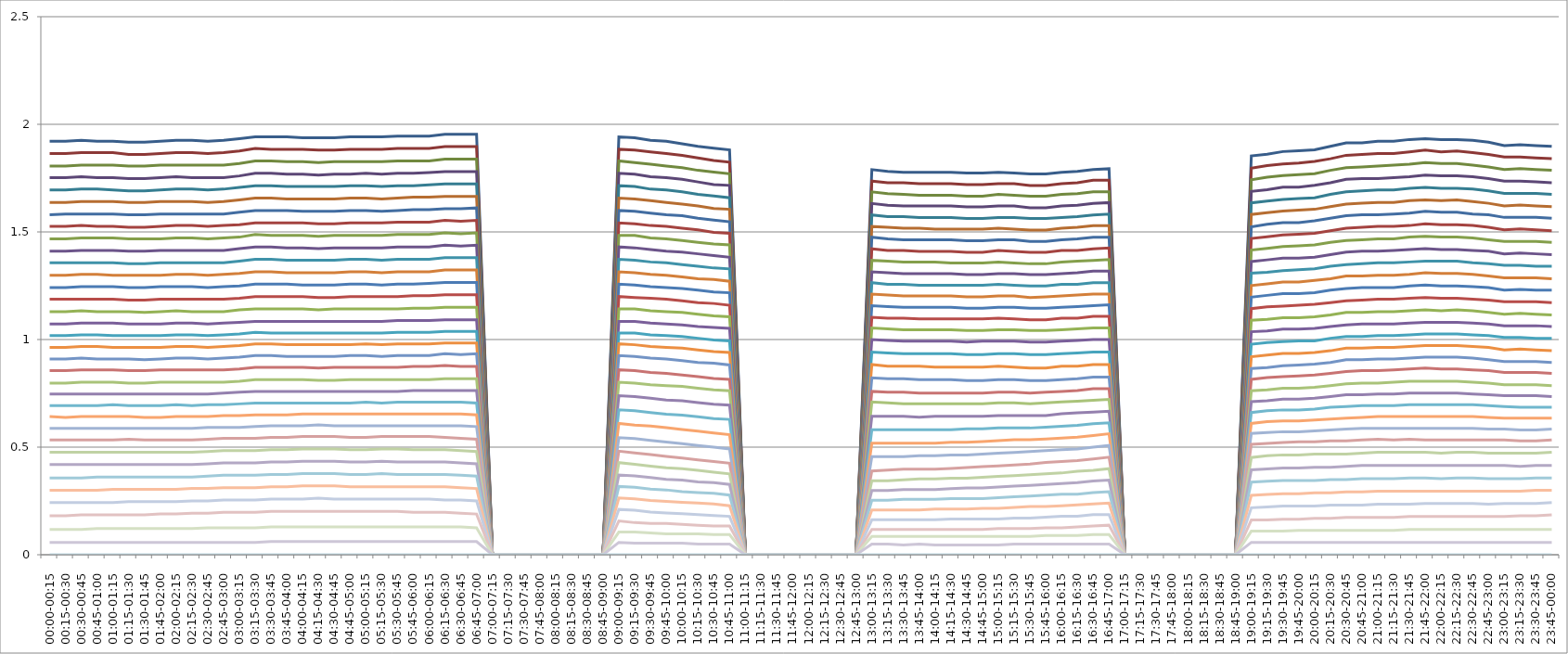
| Category | Series 0 | Series 1 | Series 2 | Series 3 | Series 4 | Series 5 | Series 6 | Series 7 | Series 8 | Series 9 | Series 10 | Series 11 | Series 12 | Series 13 | Series 14 | Series 15 | Series 16 | Series 17 | Series 18 | Series 19 | Series 20 | Series 21 | Series 22 | Series 23 | Series 24 | Series 25 | Series 26 | Series 27 | Series 28 | Series 29 | Series 30 | Series 31 | Series 32 | Series 33 | Series 34 |
|---|---|---|---|---|---|---|---|---|---|---|---|---|---|---|---|---|---|---|---|---|---|---|---|---|---|---|---|---|---|---|---|---|---|---|---|
| 00:00-00:15 | 1.921 | 1.864 | 1.806 | 1.752 | 1.695 | 1.637 | 1.579 | 1.526 | 1.468 | 1.41 | 1.356 | 1.299 | 1.241 | 1.188 | 1.13 | 1.072 | 1.018 | 0.964 | 0.91 | 0.855 | 0.798 | 0.747 | 0.693 | 0.642 | 0.588 | 0.533 | 0.476 | 0.419 | 0.357 | 0.3 | 0.242 | 0.181 | 0.118 | 0.057 | 0 |
| 00:15-00:30 | 1.921 | 1.864 | 1.806 | 1.752 | 1.695 | 1.637 | 1.583 | 1.526 | 1.468 | 1.41 | 1.356 | 1.299 | 1.241 | 1.188 | 1.13 | 1.072 | 1.018 | 0.964 | 0.91 | 0.855 | 0.798 | 0.747 | 0.693 | 0.638 | 0.588 | 0.533 | 0.476 | 0.419 | 0.357 | 0.3 | 0.242 | 0.181 | 0.118 | 0.057 | 0 |
| 00:30-00:45 | 1.925 | 1.868 | 1.81 | 1.756 | 1.699 | 1.641 | 1.583 | 1.53 | 1.472 | 1.414 | 1.356 | 1.303 | 1.245 | 1.188 | 1.134 | 1.076 | 1.022 | 0.968 | 0.914 | 0.859 | 0.802 | 0.747 | 0.693 | 0.642 | 0.588 | 0.533 | 0.476 | 0.419 | 0.357 | 0.3 | 0.242 | 0.185 | 0.118 | 0.057 | 0 |
| 00:45-01:00 | 1.921 | 1.868 | 1.81 | 1.752 | 1.699 | 1.641 | 1.583 | 1.526 | 1.472 | 1.414 | 1.356 | 1.303 | 1.245 | 1.188 | 1.13 | 1.076 | 1.022 | 0.968 | 0.91 | 0.859 | 0.802 | 0.747 | 0.693 | 0.642 | 0.588 | 0.533 | 0.476 | 0.419 | 0.361 | 0.3 | 0.242 | 0.185 | 0.121 | 0.057 | 0 |
| 01:00-01:15 | 1.921 | 1.868 | 1.81 | 1.752 | 1.695 | 1.641 | 1.583 | 1.526 | 1.472 | 1.414 | 1.356 | 1.299 | 1.245 | 1.188 | 1.13 | 1.076 | 1.018 | 0.964 | 0.91 | 0.859 | 0.802 | 0.747 | 0.697 | 0.642 | 0.588 | 0.533 | 0.476 | 0.419 | 0.361 | 0.304 | 0.242 | 0.185 | 0.121 | 0.057 | 0 |
| 01:15-01:30 | 1.917 | 1.86 | 1.806 | 1.748 | 1.691 | 1.637 | 1.579 | 1.522 | 1.468 | 1.41 | 1.352 | 1.299 | 1.241 | 1.184 | 1.13 | 1.072 | 1.018 | 0.964 | 0.91 | 0.855 | 0.798 | 0.747 | 0.693 | 0.642 | 0.588 | 0.537 | 0.476 | 0.419 | 0.361 | 0.304 | 0.246 | 0.185 | 0.121 | 0.057 | 0 |
| 01:30-01:45 | 1.917 | 1.86 | 1.806 | 1.748 | 1.691 | 1.637 | 1.579 | 1.522 | 1.468 | 1.41 | 1.352 | 1.299 | 1.241 | 1.184 | 1.126 | 1.072 | 1.018 | 0.964 | 0.906 | 0.855 | 0.798 | 0.747 | 0.693 | 0.638 | 0.588 | 0.533 | 0.476 | 0.419 | 0.361 | 0.304 | 0.246 | 0.185 | 0.121 | 0.057 | 0 |
| 01:45-02:00 | 1.921 | 1.864 | 1.81 | 1.752 | 1.695 | 1.641 | 1.583 | 1.526 | 1.468 | 1.414 | 1.356 | 1.299 | 1.245 | 1.188 | 1.13 | 1.072 | 1.018 | 0.964 | 0.91 | 0.859 | 0.802 | 0.747 | 0.693 | 0.638 | 0.588 | 0.533 | 0.476 | 0.419 | 0.361 | 0.304 | 0.246 | 0.189 | 0.121 | 0.057 | 0 |
| 02:00-02:15 | 1.925 | 1.868 | 1.81 | 1.756 | 1.699 | 1.641 | 1.583 | 1.53 | 1.472 | 1.414 | 1.356 | 1.303 | 1.245 | 1.188 | 1.134 | 1.076 | 1.022 | 0.968 | 0.914 | 0.859 | 0.802 | 0.747 | 0.697 | 0.642 | 0.588 | 0.533 | 0.476 | 0.419 | 0.361 | 0.304 | 0.246 | 0.189 | 0.121 | 0.057 | 0 |
| 02:15-02:30 | 1.925 | 1.868 | 1.81 | 1.752 | 1.699 | 1.641 | 1.583 | 1.53 | 1.472 | 1.414 | 1.356 | 1.303 | 1.245 | 1.188 | 1.13 | 1.076 | 1.022 | 0.968 | 0.914 | 0.859 | 0.802 | 0.747 | 0.693 | 0.642 | 0.588 | 0.533 | 0.476 | 0.419 | 0.361 | 0.308 | 0.25 | 0.193 | 0.121 | 0.057 | 0 |
| 02:30-02:45 | 1.921 | 1.864 | 1.81 | 1.752 | 1.695 | 1.637 | 1.583 | 1.526 | 1.468 | 1.414 | 1.356 | 1.299 | 1.241 | 1.188 | 1.13 | 1.072 | 1.018 | 0.964 | 0.91 | 0.859 | 0.802 | 0.747 | 0.697 | 0.642 | 0.592 | 0.537 | 0.48 | 0.423 | 0.365 | 0.308 | 0.25 | 0.193 | 0.125 | 0.057 | 0 |
| 02:45-03:00 | 1.925 | 1.868 | 1.81 | 1.752 | 1.699 | 1.641 | 1.583 | 1.53 | 1.472 | 1.414 | 1.356 | 1.303 | 1.245 | 1.188 | 1.13 | 1.076 | 1.022 | 0.968 | 0.914 | 0.859 | 0.802 | 0.751 | 0.697 | 0.646 | 0.592 | 0.541 | 0.484 | 0.427 | 0.369 | 0.312 | 0.254 | 0.197 | 0.125 | 0.057 | 0 |
| 03:00-03:15 | 1.933 | 1.876 | 1.818 | 1.76 | 1.707 | 1.649 | 1.591 | 1.534 | 1.476 | 1.422 | 1.364 | 1.307 | 1.249 | 1.192 | 1.138 | 1.08 | 1.026 | 0.972 | 0.918 | 0.863 | 0.806 | 0.755 | 0.701 | 0.646 | 0.592 | 0.541 | 0.484 | 0.427 | 0.369 | 0.312 | 0.254 | 0.197 | 0.125 | 0.057 | 0 |
| 03:15-03:30 | 1.941 | 1.888 | 1.83 | 1.772 | 1.715 | 1.657 | 1.599 | 1.542 | 1.488 | 1.43 | 1.372 | 1.315 | 1.257 | 1.2 | 1.142 | 1.084 | 1.034 | 0.98 | 0.926 | 0.871 | 0.814 | 0.759 | 0.705 | 0.65 | 0.596 | 0.541 | 0.484 | 0.427 | 0.369 | 0.312 | 0.254 | 0.197 | 0.125 | 0.057 | 0 |
| 03:30-03:45 | 1.941 | 1.884 | 1.83 | 1.772 | 1.715 | 1.657 | 1.599 | 1.542 | 1.484 | 1.43 | 1.372 | 1.315 | 1.257 | 1.2 | 1.142 | 1.084 | 1.03 | 0.98 | 0.926 | 0.871 | 0.814 | 0.759 | 0.705 | 0.65 | 0.6 | 0.545 | 0.488 | 0.431 | 0.373 | 0.316 | 0.258 | 0.201 | 0.129 | 0.061 | 0 |
| 03:45-04:00 | 1.941 | 1.884 | 1.826 | 1.768 | 1.711 | 1.653 | 1.599 | 1.542 | 1.484 | 1.426 | 1.368 | 1.311 | 1.257 | 1.2 | 1.142 | 1.084 | 1.03 | 0.976 | 0.922 | 0.871 | 0.814 | 0.759 | 0.705 | 0.65 | 0.6 | 0.545 | 0.488 | 0.431 | 0.373 | 0.316 | 0.258 | 0.201 | 0.129 | 0.061 | 0 |
| 04:00-04:15 | 1.937 | 1.884 | 1.826 | 1.768 | 1.711 | 1.653 | 1.595 | 1.542 | 1.484 | 1.426 | 1.368 | 1.311 | 1.253 | 1.2 | 1.142 | 1.084 | 1.03 | 0.976 | 0.922 | 0.871 | 0.814 | 0.759 | 0.705 | 0.654 | 0.6 | 0.549 | 0.492 | 0.435 | 0.377 | 0.32 | 0.258 | 0.201 | 0.129 | 0.061 | 0 |
| 04:15-04:30 | 1.937 | 1.88 | 1.822 | 1.764 | 1.711 | 1.653 | 1.595 | 1.538 | 1.48 | 1.422 | 1.368 | 1.311 | 1.253 | 1.196 | 1.138 | 1.084 | 1.03 | 0.976 | 0.922 | 0.867 | 0.81 | 0.759 | 0.705 | 0.654 | 0.604 | 0.549 | 0.492 | 0.435 | 0.377 | 0.32 | 0.262 | 0.201 | 0.129 | 0.061 | 0 |
| 04:30-04:45 | 1.937 | 1.88 | 1.826 | 1.768 | 1.711 | 1.653 | 1.595 | 1.538 | 1.484 | 1.426 | 1.368 | 1.311 | 1.253 | 1.196 | 1.142 | 1.084 | 1.03 | 0.976 | 0.922 | 0.871 | 0.81 | 0.759 | 0.705 | 0.654 | 0.6 | 0.549 | 0.492 | 0.435 | 0.377 | 0.32 | 0.258 | 0.201 | 0.129 | 0.061 | 0 |
| 04:45-05:00 | 1.941 | 1.884 | 1.826 | 1.768 | 1.715 | 1.657 | 1.599 | 1.542 | 1.484 | 1.426 | 1.372 | 1.315 | 1.257 | 1.2 | 1.142 | 1.084 | 1.03 | 0.976 | 0.926 | 0.871 | 0.814 | 0.759 | 0.705 | 0.654 | 0.6 | 0.545 | 0.488 | 0.431 | 0.373 | 0.316 | 0.258 | 0.201 | 0.129 | 0.061 | 0 |
| 05:00-05:15 | 1.941 | 1.884 | 1.826 | 1.772 | 1.715 | 1.657 | 1.599 | 1.542 | 1.484 | 1.426 | 1.372 | 1.315 | 1.257 | 1.2 | 1.142 | 1.084 | 1.03 | 0.98 | 0.926 | 0.871 | 0.814 | 0.759 | 0.709 | 0.654 | 0.6 | 0.545 | 0.488 | 0.431 | 0.373 | 0.316 | 0.258 | 0.201 | 0.129 | 0.061 | 0 |
| 05:15-05:30 | 1.941 | 1.884 | 1.826 | 1.768 | 1.711 | 1.653 | 1.595 | 1.542 | 1.484 | 1.426 | 1.368 | 1.311 | 1.253 | 1.2 | 1.142 | 1.084 | 1.03 | 0.976 | 0.922 | 0.871 | 0.814 | 0.759 | 0.705 | 0.654 | 0.6 | 0.549 | 0.492 | 0.435 | 0.377 | 0.316 | 0.258 | 0.201 | 0.129 | 0.061 | 0 |
| 05:30-05:45 | 1.945 | 1.888 | 1.83 | 1.772 | 1.715 | 1.657 | 1.599 | 1.546 | 1.488 | 1.43 | 1.372 | 1.315 | 1.257 | 1.2 | 1.142 | 1.088 | 1.034 | 0.98 | 0.926 | 0.871 | 0.814 | 0.759 | 0.709 | 0.654 | 0.6 | 0.549 | 0.492 | 0.431 | 0.373 | 0.316 | 0.258 | 0.201 | 0.129 | 0.061 | 0 |
| 05:45-06:00 | 1.945 | 1.888 | 1.83 | 1.772 | 1.715 | 1.661 | 1.603 | 1.546 | 1.488 | 1.43 | 1.372 | 1.315 | 1.257 | 1.204 | 1.146 | 1.088 | 1.034 | 0.98 | 0.926 | 0.875 | 0.814 | 0.763 | 0.709 | 0.654 | 0.6 | 0.549 | 0.488 | 0.431 | 0.373 | 0.316 | 0.258 | 0.197 | 0.129 | 0.061 | 0 |
| 06:00-06:15 | 1.945 | 1.888 | 1.83 | 1.776 | 1.719 | 1.661 | 1.603 | 1.546 | 1.488 | 1.43 | 1.372 | 1.315 | 1.261 | 1.204 | 1.146 | 1.088 | 1.034 | 0.98 | 0.926 | 0.875 | 0.814 | 0.763 | 0.709 | 0.654 | 0.6 | 0.549 | 0.488 | 0.431 | 0.373 | 0.316 | 0.258 | 0.197 | 0.129 | 0.061 | 0 |
| 06:15-06:30 | 1.953 | 1.896 | 1.838 | 1.78 | 1.723 | 1.665 | 1.607 | 1.554 | 1.496 | 1.438 | 1.38 | 1.323 | 1.265 | 1.208 | 1.15 | 1.092 | 1.038 | 0.984 | 0.934 | 0.879 | 0.818 | 0.763 | 0.709 | 0.654 | 0.6 | 0.545 | 0.488 | 0.431 | 0.373 | 0.316 | 0.254 | 0.197 | 0.129 | 0.061 | 0 |
| 06:30-06:45 | 1.953 | 1.896 | 1.838 | 1.78 | 1.723 | 1.665 | 1.607 | 1.55 | 1.492 | 1.434 | 1.38 | 1.323 | 1.265 | 1.208 | 1.15 | 1.092 | 1.038 | 0.984 | 0.93 | 0.875 | 0.818 | 0.763 | 0.709 | 0.654 | 0.6 | 0.541 | 0.484 | 0.427 | 0.369 | 0.312 | 0.254 | 0.193 | 0.129 | 0.061 | 0 |
| 06:45-07:00 | 1.953 | 1.896 | 1.838 | 1.78 | 1.723 | 1.665 | 1.611 | 1.554 | 1.496 | 1.438 | 1.38 | 1.323 | 1.265 | 1.208 | 1.15 | 1.092 | 1.038 | 0.984 | 0.934 | 0.875 | 0.818 | 0.763 | 0.705 | 0.65 | 0.596 | 0.537 | 0.48 | 0.423 | 0.365 | 0.308 | 0.25 | 0.189 | 0.125 | 0.061 | 0 |
| 07:00-07:15 | 0 | 0 | 0 | 0 | 0 | 0 | 0 | 0 | 0 | 0 | 0 | 0 | 0 | 0 | 0 | 0 | 0 | 0 | 0 | 0 | 0 | 0 | 0 | 0 | 0 | 0 | 0 | 0 | 0 | 0 | 0 | 0 | 0 | 0 | 0 |
| 07:15-07:30 | 0 | 0 | 0 | 0 | 0 | 0 | 0 | 0 | 0 | 0 | 0 | 0 | 0 | 0 | 0 | 0 | 0 | 0 | 0 | 0 | 0 | 0 | 0 | 0 | 0 | 0 | 0 | 0 | 0 | 0 | 0 | 0 | 0 | 0 | 0 |
| 07:30-07:45 | 0 | 0 | 0 | 0 | 0 | 0 | 0 | 0 | 0 | 0 | 0 | 0 | 0 | 0 | 0 | 0 | 0 | 0 | 0 | 0 | 0 | 0 | 0 | 0 | 0 | 0 | 0 | 0 | 0 | 0 | 0 | 0 | 0 | 0 | 0 |
| 07:45-08:00 | 0 | 0 | 0 | 0 | 0 | 0 | 0 | 0 | 0 | 0 | 0 | 0 | 0 | 0 | 0 | 0 | 0 | 0 | 0 | 0 | 0 | 0 | 0 | 0 | 0 | 0 | 0 | 0 | 0 | 0 | 0 | 0 | 0 | 0 | 0 |
| 08:00-08:15 | 0 | 0 | 0 | 0 | 0 | 0 | 0 | 0 | 0 | 0 | 0 | 0 | 0 | 0 | 0 | 0 | 0 | 0 | 0 | 0 | 0 | 0 | 0 | 0 | 0 | 0 | 0 | 0 | 0 | 0 | 0 | 0 | 0 | 0 | 0 |
| 08:15-08:30 | 0 | 0 | 0 | 0 | 0 | 0 | 0 | 0 | 0 | 0 | 0 | 0 | 0 | 0 | 0 | 0 | 0 | 0 | 0 | 0 | 0 | 0 | 0 | 0 | 0 | 0 | 0 | 0 | 0 | 0 | 0 | 0 | 0 | 0 | 0 |
| 08:30-08:45 | 0 | 0 | 0 | 0 | 0 | 0 | 0 | 0 | 0 | 0 | 0 | 0 | 0 | 0 | 0 | 0 | 0 | 0 | 0 | 0 | 0 | 0 | 0 | 0 | 0 | 0 | 0 | 0 | 0 | 0 | 0 | 0 | 0 | 0 | 0 |
| 08:45-09:00 | 0 | 0 | 0 | 0 | 0 | 0 | 0 | 0 | 0 | 0 | 0 | 0 | 0 | 0 | 0 | 0 | 0 | 0 | 0 | 0 | 0 | 0 | 0 | 0 | 0 | 0 | 0 | 0 | 0 | 0 | 0 | 0 | 0 | 0 | 0 |
| 09:00-09:15 | 1.941 | 1.884 | 1.83 | 1.772 | 1.715 | 1.657 | 1.599 | 1.542 | 1.484 | 1.43 | 1.372 | 1.315 | 1.257 | 1.2 | 1.142 | 1.084 | 1.03 | 0.98 | 0.926 | 0.859 | 0.802 | 0.739 | 0.673 | 0.61 | 0.544 | 0.481 | 0.428 | 0.371 | 0.317 | 0.264 | 0.21 | 0.157 | 0.106 | 0.057 | 0 |
| 09:15-09:30 | 1.937 | 1.88 | 1.822 | 1.768 | 1.711 | 1.653 | 1.595 | 1.538 | 1.484 | 1.426 | 1.368 | 1.311 | 1.253 | 1.196 | 1.142 | 1.084 | 1.03 | 0.976 | 0.922 | 0.855 | 0.798 | 0.735 | 0.669 | 0.602 | 0.54 | 0.473 | 0.42 | 0.367 | 0.313 | 0.26 | 0.206 | 0.149 | 0.106 | 0.053 | 0 |
| 09:30-09:45 | 1.925 | 1.872 | 1.814 | 1.756 | 1.699 | 1.645 | 1.587 | 1.53 | 1.472 | 1.418 | 1.36 | 1.303 | 1.245 | 1.192 | 1.134 | 1.076 | 1.022 | 0.968 | 0.914 | 0.847 | 0.79 | 0.727 | 0.661 | 0.598 | 0.532 | 0.465 | 0.412 | 0.359 | 0.305 | 0.252 | 0.198 | 0.145 | 0.102 | 0.053 | 0 |
| 09:45-10:00 | 1.921 | 1.864 | 1.806 | 1.752 | 1.695 | 1.637 | 1.579 | 1.526 | 1.468 | 1.41 | 1.356 | 1.299 | 1.241 | 1.188 | 1.13 | 1.072 | 1.018 | 0.964 | 0.91 | 0.843 | 0.786 | 0.719 | 0.653 | 0.59 | 0.524 | 0.457 | 0.404 | 0.351 | 0.301 | 0.248 | 0.194 | 0.145 | 0.098 | 0.053 | 0 |
| 10:00-10:15 | 1.909 | 1.856 | 1.798 | 1.744 | 1.687 | 1.629 | 1.575 | 1.518 | 1.46 | 1.406 | 1.348 | 1.291 | 1.237 | 1.18 | 1.126 | 1.068 | 1.014 | 0.96 | 0.902 | 0.835 | 0.782 | 0.715 | 0.649 | 0.582 | 0.516 | 0.449 | 0.4 | 0.347 | 0.293 | 0.244 | 0.19 | 0.141 | 0.098 | 0.053 | 0 |
| 10:15-10:30 | 1.897 | 1.844 | 1.786 | 1.732 | 1.675 | 1.621 | 1.563 | 1.51 | 1.452 | 1.398 | 1.34 | 1.283 | 1.229 | 1.172 | 1.118 | 1.06 | 1.006 | 0.952 | 0.894 | 0.827 | 0.774 | 0.707 | 0.641 | 0.574 | 0.508 | 0.441 | 0.392 | 0.339 | 0.289 | 0.24 | 0.186 | 0.137 | 0.098 | 0.049 | 0 |
| 10:30-10:45 | 1.889 | 1.832 | 1.778 | 1.72 | 1.667 | 1.609 | 1.555 | 1.498 | 1.444 | 1.39 | 1.332 | 1.279 | 1.221 | 1.168 | 1.11 | 1.056 | 0.998 | 0.944 | 0.89 | 0.819 | 0.766 | 0.699 | 0.633 | 0.566 | 0.5 | 0.433 | 0.384 | 0.335 | 0.285 | 0.236 | 0.182 | 0.133 | 0.094 | 0.049 | 0 |
| 10:45-11:00 | 1.881 | 1.824 | 1.77 | 1.716 | 1.659 | 1.605 | 1.547 | 1.494 | 1.44 | 1.382 | 1.328 | 1.271 | 1.217 | 1.16 | 1.106 | 1.052 | 0.994 | 0.94 | 0.882 | 0.815 | 0.762 | 0.695 | 0.629 | 0.558 | 0.492 | 0.425 | 0.376 | 0.327 | 0.277 | 0.228 | 0.178 | 0.133 | 0.094 | 0.049 | 0 |
| 11:00-11:15 | 0 | 0 | 0 | 0 | 0 | 0 | 0 | 0 | 0 | 0 | 0 | 0 | 0 | 0 | 0 | 0 | 0 | 0 | 0 | 0 | 0 | 0 | 0 | 0 | 0 | 0 | 0 | 0 | 0 | 0 | 0 | 0 | 0 | 0 | 0 |
| 11:15-11:30 | 0 | 0 | 0 | 0 | 0 | 0 | 0 | 0 | 0 | 0 | 0 | 0 | 0 | 0 | 0 | 0 | 0 | 0 | 0 | 0 | 0 | 0 | 0 | 0 | 0 | 0 | 0 | 0 | 0 | 0 | 0 | 0 | 0 | 0 | 0 |
| 11:30-11:45 | 0 | 0 | 0 | 0 | 0 | 0 | 0 | 0 | 0 | 0 | 0 | 0 | 0 | 0 | 0 | 0 | 0 | 0 | 0 | 0 | 0 | 0 | 0 | 0 | 0 | 0 | 0 | 0 | 0 | 0 | 0 | 0 | 0 | 0 | 0 |
| 11:45-12:00 | 0 | 0 | 0 | 0 | 0 | 0 | 0 | 0 | 0 | 0 | 0 | 0 | 0 | 0 | 0 | 0 | 0 | 0 | 0 | 0 | 0 | 0 | 0 | 0 | 0 | 0 | 0 | 0 | 0 | 0 | 0 | 0 | 0 | 0 | 0 |
| 12:00-12:15 | 0 | 0 | 0 | 0 | 0 | 0 | 0 | 0 | 0 | 0 | 0 | 0 | 0 | 0 | 0 | 0 | 0 | 0 | 0 | 0 | 0 | 0 | 0 | 0 | 0 | 0 | 0 | 0 | 0 | 0 | 0 | 0 | 0 | 0 | 0 |
| 12:15-12:30 | 0 | 0 | 0 | 0 | 0 | 0 | 0 | 0 | 0 | 0 | 0 | 0 | 0 | 0 | 0 | 0 | 0 | 0 | 0 | 0 | 0 | 0 | 0 | 0 | 0 | 0 | 0 | 0 | 0 | 0 | 0 | 0 | 0 | 0 | 0 |
| 12:30-12:45 | 0 | 0 | 0 | 0 | 0 | 0 | 0 | 0 | 0 | 0 | 0 | 0 | 0 | 0 | 0 | 0 | 0 | 0 | 0 | 0 | 0 | 0 | 0 | 0 | 0 | 0 | 0 | 0 | 0 | 0 | 0 | 0 | 0 | 0 | 0 |
| 12:45-13:00 | 0 | 0 | 0 | 0 | 0 | 0 | 0 | 0 | 0 | 0 | 0 | 0 | 0 | 0 | 0 | 0 | 0 | 0 | 0 | 0 | 0 | 0 | 0 | 0 | 0 | 0 | 0 | 0 | 0 | 0 | 0 | 0 | 0 | 0 | 0 |
| 13:00-13:15 | 1.789 | 1.736 | 1.686 | 1.632 | 1.579 | 1.525 | 1.475 | 1.422 | 1.368 | 1.314 | 1.264 | 1.211 | 1.157 | 1.104 | 1.054 | 1 | 0.942 | 0.884 | 0.822 | 0.759 | 0.71 | 0.643 | 0.581 | 0.518 | 0.456 | 0.389 | 0.344 | 0.299 | 0.253 | 0.208 | 0.162 | 0.117 | 0.086 | 0.049 | 0 |
| 13:15-13:30 | 1.781 | 1.728 | 1.678 | 1.624 | 1.571 | 1.521 | 1.467 | 1.414 | 1.364 | 1.31 | 1.256 | 1.207 | 1.153 | 1.1 | 1.05 | 0.996 | 0.938 | 0.876 | 0.818 | 0.755 | 0.706 | 0.643 | 0.581 | 0.518 | 0.456 | 0.393 | 0.344 | 0.299 | 0.253 | 0.208 | 0.162 | 0.117 | 0.086 | 0.049 | 0 |
| 13:30-13:45 | 1.777 | 1.728 | 1.674 | 1.62 | 1.571 | 1.517 | 1.463 | 1.414 | 1.36 | 1.306 | 1.256 | 1.203 | 1.149 | 1.1 | 1.046 | 0.992 | 0.934 | 0.876 | 0.818 | 0.755 | 0.702 | 0.643 | 0.581 | 0.518 | 0.456 | 0.397 | 0.348 | 0.303 | 0.257 | 0.208 | 0.162 | 0.117 | 0.086 | 0.045 | 0 |
| 13:45-14:00 | 1.777 | 1.724 | 1.67 | 1.62 | 1.567 | 1.517 | 1.463 | 1.41 | 1.36 | 1.306 | 1.252 | 1.203 | 1.149 | 1.096 | 1.046 | 0.992 | 0.934 | 0.876 | 0.814 | 0.751 | 0.702 | 0.639 | 0.581 | 0.518 | 0.46 | 0.397 | 0.352 | 0.303 | 0.257 | 0.208 | 0.162 | 0.117 | 0.086 | 0.049 | 0 |
| 14:00-14:15 | 1.777 | 1.724 | 1.67 | 1.62 | 1.567 | 1.513 | 1.463 | 1.41 | 1.36 | 1.306 | 1.252 | 1.203 | 1.149 | 1.096 | 1.046 | 0.992 | 0.934 | 0.872 | 0.814 | 0.751 | 0.702 | 0.643 | 0.581 | 0.518 | 0.46 | 0.397 | 0.352 | 0.303 | 0.257 | 0.212 | 0.162 | 0.117 | 0.086 | 0.045 | 0 |
| 14:15-14:30 | 1.777 | 1.724 | 1.67 | 1.62 | 1.567 | 1.513 | 1.463 | 1.41 | 1.356 | 1.306 | 1.252 | 1.203 | 1.149 | 1.096 | 1.046 | 0.992 | 0.934 | 0.872 | 0.814 | 0.751 | 0.702 | 0.643 | 0.581 | 0.522 | 0.464 | 0.401 | 0.356 | 0.307 | 0.261 | 0.212 | 0.166 | 0.117 | 0.086 | 0.045 | 0 |
| 14:30-14:45 | 1.773 | 1.72 | 1.666 | 1.616 | 1.563 | 1.513 | 1.459 | 1.406 | 1.356 | 1.302 | 1.252 | 1.199 | 1.145 | 1.096 | 1.042 | 0.988 | 0.93 | 0.872 | 0.81 | 0.751 | 0.702 | 0.643 | 0.585 | 0.522 | 0.464 | 0.405 | 0.356 | 0.311 | 0.261 | 0.212 | 0.166 | 0.117 | 0.086 | 0.045 | 0 |
| 14:45-15:00 | 1.773 | 1.72 | 1.666 | 1.616 | 1.563 | 1.513 | 1.459 | 1.406 | 1.356 | 1.302 | 1.252 | 1.199 | 1.145 | 1.096 | 1.042 | 0.992 | 0.93 | 0.872 | 0.81 | 0.751 | 0.702 | 0.643 | 0.585 | 0.526 | 0.468 | 0.409 | 0.36 | 0.311 | 0.261 | 0.216 | 0.166 | 0.117 | 0.086 | 0.045 | 0 |
| 15:00-15:15 | 1.777 | 1.724 | 1.674 | 1.62 | 1.567 | 1.517 | 1.463 | 1.414 | 1.36 | 1.306 | 1.256 | 1.203 | 1.149 | 1.1 | 1.046 | 0.992 | 0.934 | 0.876 | 0.814 | 0.755 | 0.706 | 0.647 | 0.589 | 0.53 | 0.472 | 0.413 | 0.364 | 0.315 | 0.265 | 0.216 | 0.166 | 0.121 | 0.086 | 0.045 | 0 |
| 15:15-15:30 | 1.773 | 1.724 | 1.67 | 1.62 | 1.567 | 1.513 | 1.463 | 1.41 | 1.356 | 1.306 | 1.252 | 1.203 | 1.149 | 1.096 | 1.046 | 0.992 | 0.934 | 0.872 | 0.814 | 0.755 | 0.706 | 0.647 | 0.589 | 0.534 | 0.476 | 0.417 | 0.368 | 0.319 | 0.269 | 0.22 | 0.17 | 0.121 | 0.086 | 0.049 | 0 |
| 15:30-15:45 | 1.769 | 1.716 | 1.666 | 1.612 | 1.563 | 1.509 | 1.455 | 1.406 | 1.352 | 1.302 | 1.248 | 1.195 | 1.145 | 1.092 | 1.042 | 0.988 | 0.93 | 0.868 | 0.81 | 0.751 | 0.702 | 0.647 | 0.589 | 0.534 | 0.48 | 0.421 | 0.372 | 0.323 | 0.273 | 0.224 | 0.17 | 0.121 | 0.086 | 0.049 | 0 |
| 15:45-16:00 | 1.769 | 1.716 | 1.666 | 1.612 | 1.563 | 1.509 | 1.455 | 1.406 | 1.352 | 1.302 | 1.248 | 1.199 | 1.145 | 1.092 | 1.042 | 0.988 | 0.93 | 0.868 | 0.81 | 0.755 | 0.706 | 0.647 | 0.593 | 0.538 | 0.484 | 0.429 | 0.376 | 0.327 | 0.277 | 0.224 | 0.174 | 0.125 | 0.09 | 0.049 | 0 |
| 16:00-16:15 | 1.777 | 1.724 | 1.674 | 1.62 | 1.567 | 1.517 | 1.463 | 1.414 | 1.36 | 1.306 | 1.256 | 1.203 | 1.149 | 1.1 | 1.046 | 0.992 | 0.934 | 0.876 | 0.814 | 0.759 | 0.71 | 0.655 | 0.597 | 0.542 | 0.488 | 0.433 | 0.38 | 0.331 | 0.281 | 0.228 | 0.178 | 0.125 | 0.09 | 0.049 | 0 |
| 16:15-16:30 | 1.781 | 1.728 | 1.678 | 1.624 | 1.571 | 1.521 | 1.467 | 1.414 | 1.364 | 1.31 | 1.256 | 1.207 | 1.153 | 1.1 | 1.05 | 0.996 | 0.938 | 0.876 | 0.818 | 0.763 | 0.714 | 0.659 | 0.601 | 0.546 | 0.492 | 0.437 | 0.388 | 0.335 | 0.281 | 0.232 | 0.178 | 0.129 | 0.09 | 0.049 | 0 |
| 16:30-16:45 | 1.789 | 1.74 | 1.686 | 1.632 | 1.579 | 1.529 | 1.475 | 1.422 | 1.368 | 1.318 | 1.264 | 1.211 | 1.157 | 1.108 | 1.054 | 1 | 0.942 | 0.884 | 0.826 | 0.771 | 0.718 | 0.663 | 0.609 | 0.554 | 0.5 | 0.445 | 0.392 | 0.343 | 0.289 | 0.236 | 0.186 | 0.133 | 0.094 | 0.049 | 0 |
| 16:45-17:00 | 1.793 | 1.74 | 1.686 | 1.636 | 1.583 | 1.529 | 1.475 | 1.426 | 1.372 | 1.318 | 1.264 | 1.211 | 1.161 | 1.108 | 1.054 | 1 | 0.942 | 0.884 | 0.826 | 0.771 | 0.722 | 0.667 | 0.613 | 0.562 | 0.508 | 0.453 | 0.4 | 0.347 | 0.293 | 0.24 | 0.186 | 0.137 | 0.094 | 0.049 | 0 |
| 17:00-17:15 | 0 | 0 | 0 | 0 | 0 | 0 | 0 | 0 | 0 | 0 | 0 | 0 | 0 | 0 | 0 | 0 | 0 | 0 | 0 | 0 | 0 | 0 | 0 | 0 | 0 | 0 | 0 | 0 | 0 | 0 | 0 | 0 | 0 | 0 | 0 |
| 17:15-17:30 | 0 | 0 | 0 | 0 | 0 | 0 | 0 | 0 | 0 | 0 | 0 | 0 | 0 | 0 | 0 | 0 | 0 | 0 | 0 | 0 | 0 | 0 | 0 | 0 | 0 | 0 | 0 | 0 | 0 | 0 | 0 | 0 | 0 | 0 | 0 |
| 17:30-17:45 | 0 | 0 | 0 | 0 | 0 | 0 | 0 | 0 | 0 | 0 | 0 | 0 | 0 | 0 | 0 | 0 | 0 | 0 | 0 | 0 | 0 | 0 | 0 | 0 | 0 | 0 | 0 | 0 | 0 | 0 | 0 | 0 | 0 | 0 | 0 |
| 17:45-18:00 | 0 | 0 | 0 | 0 | 0 | 0 | 0 | 0 | 0 | 0 | 0 | 0 | 0 | 0 | 0 | 0 | 0 | 0 | 0 | 0 | 0 | 0 | 0 | 0 | 0 | 0 | 0 | 0 | 0 | 0 | 0 | 0 | 0 | 0 | 0 |
| 18:00-18:15 | 0 | 0 | 0 | 0 | 0 | 0 | 0 | 0 | 0 | 0 | 0 | 0 | 0 | 0 | 0 | 0 | 0 | 0 | 0 | 0 | 0 | 0 | 0 | 0 | 0 | 0 | 0 | 0 | 0 | 0 | 0 | 0 | 0 | 0 | 0 |
| 18:15-18:30 | 0 | 0 | 0 | 0 | 0 | 0 | 0 | 0 | 0 | 0 | 0 | 0 | 0 | 0 | 0 | 0 | 0 | 0 | 0 | 0 | 0 | 0 | 0 | 0 | 0 | 0 | 0 | 0 | 0 | 0 | 0 | 0 | 0 | 0 | 0 |
| 18:30-18:45 | 0 | 0 | 0 | 0 | 0 | 0 | 0 | 0 | 0 | 0 | 0 | 0 | 0 | 0 | 0 | 0 | 0 | 0 | 0 | 0 | 0 | 0 | 0 | 0 | 0 | 0 | 0 | 0 | 0 | 0 | 0 | 0 | 0 | 0 | 0 |
| 18:45-19:00 | 0 | 0 | 0 | 0 | 0 | 0 | 0 | 0 | 0 | 0 | 0 | 0 | 0 | 0 | 0 | 0 | 0 | 0 | 0 | 0 | 0 | 0 | 0 | 0 | 0 | 0 | 0 | 0 | 0 | 0 | 0 | 0 | 0 | 0 | 0 |
| 19:00-19:15 | 1.853 | 1.796 | 1.742 | 1.688 | 1.635 | 1.581 | 1.523 | 1.47 | 1.416 | 1.362 | 1.308 | 1.251 | 1.197 | 1.144 | 1.09 | 1.036 | 0.978 | 0.92 | 0.866 | 0.815 | 0.762 | 0.711 | 0.661 | 0.61 | 0.564 | 0.513 | 0.452 | 0.395 | 0.337 | 0.276 | 0.218 | 0.161 | 0.11 | 0.057 | 0 |
| 19:15-19:30 | 1.861 | 1.808 | 1.754 | 1.696 | 1.643 | 1.589 | 1.535 | 1.478 | 1.424 | 1.37 | 1.312 | 1.259 | 1.205 | 1.152 | 1.094 | 1.04 | 0.986 | 0.928 | 0.87 | 0.823 | 0.766 | 0.715 | 0.669 | 0.618 | 0.568 | 0.517 | 0.46 | 0.399 | 0.341 | 0.28 | 0.222 | 0.161 | 0.11 | 0.057 | 0 |
| 19:30-19:45 | 1.873 | 1.816 | 1.762 | 1.708 | 1.651 | 1.597 | 1.543 | 1.486 | 1.432 | 1.378 | 1.32 | 1.267 | 1.213 | 1.156 | 1.102 | 1.048 | 0.99 | 0.936 | 0.878 | 0.827 | 0.774 | 0.723 | 0.673 | 0.622 | 0.572 | 0.521 | 0.464 | 0.403 | 0.345 | 0.284 | 0.226 | 0.165 | 0.11 | 0.057 | 0 |
| 19:45-20:00 | 1.877 | 1.82 | 1.766 | 1.708 | 1.655 | 1.601 | 1.543 | 1.49 | 1.436 | 1.378 | 1.324 | 1.267 | 1.213 | 1.16 | 1.102 | 1.048 | 0.994 | 0.936 | 0.882 | 0.831 | 0.774 | 0.723 | 0.673 | 0.622 | 0.572 | 0.525 | 0.464 | 0.403 | 0.345 | 0.284 | 0.226 | 0.165 | 0.114 | 0.057 | 0 |
| 20:00-20:15 | 1.881 | 1.828 | 1.77 | 1.716 | 1.659 | 1.605 | 1.551 | 1.494 | 1.44 | 1.382 | 1.328 | 1.275 | 1.217 | 1.164 | 1.106 | 1.052 | 0.994 | 0.94 | 0.886 | 0.835 | 0.778 | 0.727 | 0.677 | 0.626 | 0.576 | 0.525 | 0.468 | 0.407 | 0.345 | 0.288 | 0.226 | 0.169 | 0.114 | 0.057 | 0 |
| 20:15-20:30 | 1.897 | 1.84 | 1.786 | 1.728 | 1.675 | 1.617 | 1.563 | 1.506 | 1.452 | 1.394 | 1.34 | 1.283 | 1.229 | 1.172 | 1.114 | 1.06 | 1.006 | 0.948 | 0.894 | 0.843 | 0.786 | 0.735 | 0.685 | 0.63 | 0.58 | 0.529 | 0.468 | 0.407 | 0.349 | 0.288 | 0.23 | 0.169 | 0.114 | 0.057 | 0 |
| 20:30-20:45 | 1.913 | 1.856 | 1.798 | 1.744 | 1.687 | 1.629 | 1.575 | 1.518 | 1.46 | 1.406 | 1.348 | 1.295 | 1.237 | 1.18 | 1.126 | 1.068 | 1.014 | 0.96 | 0.906 | 0.851 | 0.794 | 0.743 | 0.689 | 0.634 | 0.584 | 0.529 | 0.468 | 0.411 | 0.349 | 0.292 | 0.23 | 0.173 | 0.114 | 0.057 | 0 |
| 20:45-21:00 | 1.913 | 1.86 | 1.802 | 1.748 | 1.691 | 1.633 | 1.579 | 1.522 | 1.464 | 1.41 | 1.352 | 1.295 | 1.241 | 1.184 | 1.126 | 1.072 | 1.014 | 0.96 | 0.906 | 0.855 | 0.798 | 0.743 | 0.693 | 0.638 | 0.588 | 0.533 | 0.472 | 0.415 | 0.353 | 0.292 | 0.23 | 0.173 | 0.114 | 0.057 | 0 |
| 21:00-21:15 | 1.921 | 1.864 | 1.806 | 1.748 | 1.695 | 1.637 | 1.579 | 1.526 | 1.468 | 1.41 | 1.356 | 1.299 | 1.241 | 1.188 | 1.13 | 1.072 | 1.018 | 0.964 | 0.91 | 0.855 | 0.798 | 0.747 | 0.693 | 0.642 | 0.588 | 0.537 | 0.476 | 0.415 | 0.353 | 0.296 | 0.234 | 0.173 | 0.114 | 0.057 | 0 |
| 21:15-21:30 | 1.921 | 1.864 | 1.81 | 1.752 | 1.695 | 1.637 | 1.583 | 1.526 | 1.468 | 1.414 | 1.356 | 1.299 | 1.241 | 1.188 | 1.13 | 1.072 | 1.018 | 0.964 | 0.91 | 0.859 | 0.802 | 0.747 | 0.693 | 0.642 | 0.588 | 0.533 | 0.476 | 0.415 | 0.353 | 0.296 | 0.234 | 0.173 | 0.114 | 0.057 | 0 |
| 21:30-21:45 | 1.929 | 1.872 | 1.814 | 1.756 | 1.703 | 1.645 | 1.587 | 1.53 | 1.476 | 1.418 | 1.36 | 1.303 | 1.249 | 1.192 | 1.134 | 1.076 | 1.022 | 0.968 | 0.914 | 0.863 | 0.806 | 0.751 | 0.697 | 0.642 | 0.588 | 0.537 | 0.476 | 0.415 | 0.357 | 0.296 | 0.234 | 0.177 | 0.118 | 0.057 | 0 |
| 21:45-22:00 | 1.933 | 1.88 | 1.822 | 1.764 | 1.707 | 1.649 | 1.595 | 1.538 | 1.48 | 1.422 | 1.364 | 1.311 | 1.253 | 1.196 | 1.138 | 1.08 | 1.026 | 0.972 | 0.918 | 0.867 | 0.806 | 0.751 | 0.697 | 0.642 | 0.588 | 0.533 | 0.476 | 0.415 | 0.357 | 0.296 | 0.238 | 0.177 | 0.118 | 0.057 | 0 |
| 22:00-22:15 | 1.929 | 1.872 | 1.818 | 1.76 | 1.703 | 1.645 | 1.591 | 1.534 | 1.476 | 1.418 | 1.364 | 1.307 | 1.249 | 1.192 | 1.134 | 1.08 | 1.026 | 0.972 | 0.918 | 0.863 | 0.806 | 0.751 | 0.697 | 0.642 | 0.588 | 0.533 | 0.472 | 0.415 | 0.353 | 0.296 | 0.238 | 0.177 | 0.118 | 0.057 | 0 |
| 22:15-22:30 | 1.929 | 1.876 | 1.818 | 1.76 | 1.703 | 1.649 | 1.591 | 1.534 | 1.476 | 1.418 | 1.364 | 1.307 | 1.249 | 1.192 | 1.138 | 1.08 | 1.026 | 0.972 | 0.918 | 0.863 | 0.806 | 0.751 | 0.697 | 0.642 | 0.588 | 0.533 | 0.476 | 0.415 | 0.357 | 0.296 | 0.238 | 0.177 | 0.118 | 0.057 | 0 |
| 22:30-22:45 | 1.925 | 1.868 | 1.81 | 1.756 | 1.699 | 1.641 | 1.583 | 1.53 | 1.472 | 1.414 | 1.356 | 1.303 | 1.245 | 1.188 | 1.134 | 1.076 | 1.022 | 0.968 | 0.914 | 0.859 | 0.802 | 0.747 | 0.697 | 0.642 | 0.588 | 0.533 | 0.476 | 0.415 | 0.357 | 0.296 | 0.238 | 0.177 | 0.118 | 0.057 | 0 |
| 22:45-23:00 | 1.917 | 1.86 | 1.802 | 1.748 | 1.691 | 1.633 | 1.579 | 1.522 | 1.464 | 1.41 | 1.352 | 1.295 | 1.241 | 1.184 | 1.126 | 1.072 | 1.018 | 0.964 | 0.906 | 0.855 | 0.798 | 0.743 | 0.693 | 0.638 | 0.584 | 0.533 | 0.472 | 0.415 | 0.353 | 0.296 | 0.234 | 0.177 | 0.118 | 0.057 | 0 |
| 23:00-23:15 | 1.901 | 1.848 | 1.79 | 1.736 | 1.679 | 1.621 | 1.567 | 1.51 | 1.456 | 1.398 | 1.344 | 1.287 | 1.229 | 1.176 | 1.118 | 1.064 | 1.01 | 0.952 | 0.898 | 0.847 | 0.79 | 0.739 | 0.689 | 0.634 | 0.584 | 0.533 | 0.472 | 0.415 | 0.353 | 0.296 | 0.238 | 0.177 | 0.118 | 0.057 | 0 |
| 23:15-23:30 | 1.905 | 1.848 | 1.794 | 1.736 | 1.679 | 1.625 | 1.567 | 1.514 | 1.456 | 1.402 | 1.344 | 1.287 | 1.233 | 1.176 | 1.122 | 1.064 | 1.01 | 0.956 | 0.898 | 0.847 | 0.79 | 0.739 | 0.685 | 0.634 | 0.58 | 0.529 | 0.472 | 0.411 | 0.353 | 0.296 | 0.238 | 0.181 | 0.118 | 0.057 | 0 |
| 23:30-23:45 | 1.901 | 1.844 | 1.79 | 1.732 | 1.679 | 1.621 | 1.567 | 1.51 | 1.456 | 1.398 | 1.34 | 1.287 | 1.229 | 1.176 | 1.118 | 1.064 | 1.006 | 0.952 | 0.898 | 0.847 | 0.79 | 0.739 | 0.685 | 0.634 | 0.58 | 0.529 | 0.472 | 0.415 | 0.357 | 0.3 | 0.238 | 0.181 | 0.118 | 0.057 | 0 |
| 23:45-00:00 | 1.897 | 1.84 | 1.786 | 1.728 | 1.675 | 1.617 | 1.563 | 1.506 | 1.452 | 1.394 | 1.34 | 1.283 | 1.229 | 1.172 | 1.114 | 1.06 | 1.006 | 0.948 | 0.894 | 0.843 | 0.786 | 0.735 | 0.685 | 0.634 | 0.584 | 0.533 | 0.476 | 0.415 | 0.357 | 0.3 | 0.242 | 0.185 | 0.118 | 0.057 | 0 |